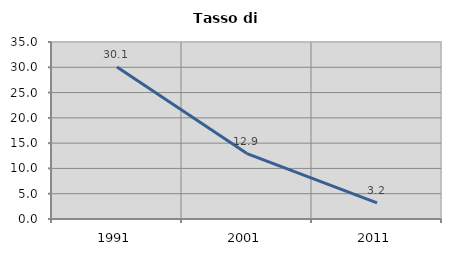
| Category | Tasso di disoccupazione   |
|---|---|
| 1991.0 | 30.069 |
| 2001.0 | 12.931 |
| 2011.0 | 3.186 |